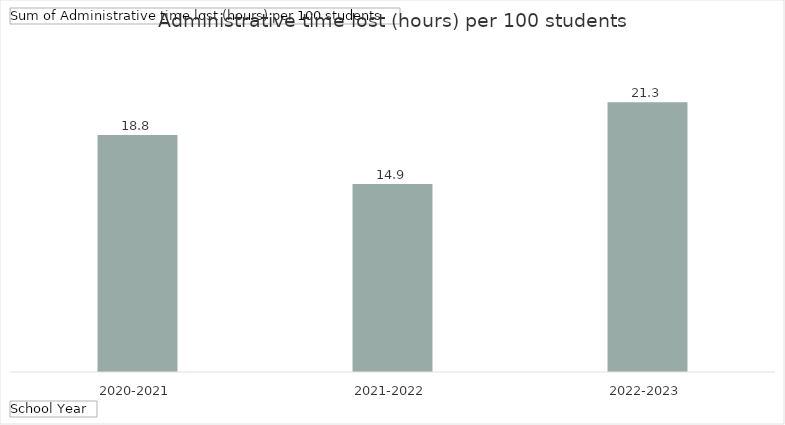
| Category | Total |
|---|---|
| 2020-2021 | 18.75 |
| 2021-2022 | 14.881 |
| 2022-2023 | 21.341 |